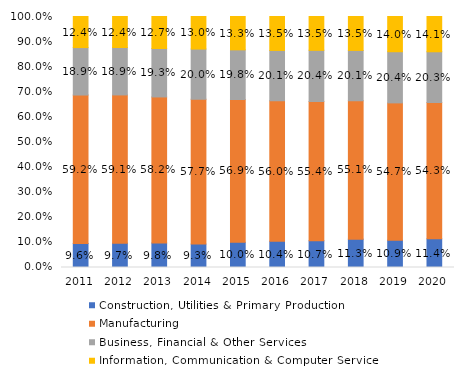
| Category | Construction, Utilities & Primary Production  | Manufacturing  | Business, Financial & Other Services | Information, Communication & Computer Services |
|---|---|---|---|---|
| 2011.0 | 0.096 | 0.592 | 0.189 | 0.124 |
| 2012.0 | 0.097 | 0.591 | 0.189 | 0.124 |
| 2013.0 | 0.098 | 0.582 | 0.193 | 0.127 |
| 2014.0 | 0.093 | 0.577 | 0.2 | 0.13 |
| 2015.0 | 0.1 | 0.569 | 0.198 | 0.133 |
| 2016.0 | 0.104 | 0.56 | 0.201 | 0.135 |
| 2017.0 | 0.107 | 0.554 | 0.204 | 0.135 |
| 2018.0 | 0.113 | 0.551 | 0.201 | 0.135 |
| 2019.0 | 0.109 | 0.547 | 0.204 | 0.14 |
| 2020.0 | 0.114 | 0.543 | 0.203 | 0.141 |